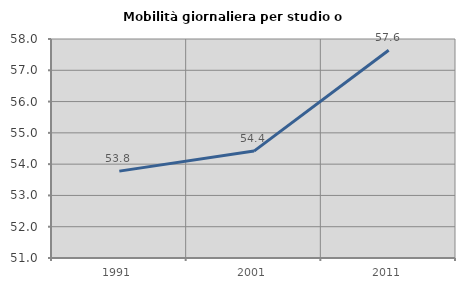
| Category | Mobilità giornaliera per studio o lavoro |
|---|---|
| 1991.0 | 53.776 |
| 2001.0 | 54.417 |
| 2011.0 | 57.639 |